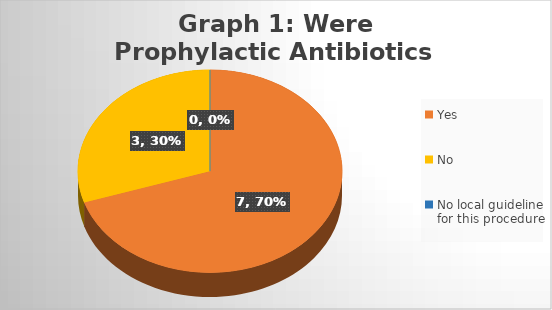
| Category | Series 0 |
|---|---|
| Yes | 7 |
| No | 3 |
| No local guideline for this procedure | 0 |